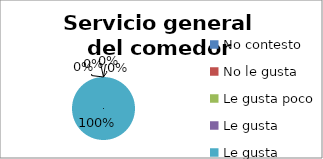
| Category | Series 0 |
|---|---|
| No contesto | 0 |
| No le gusta | 0 |
| Le gusta poco | 0 |
| Le gusta | 0 |
| Le gusta mucho | 7 |